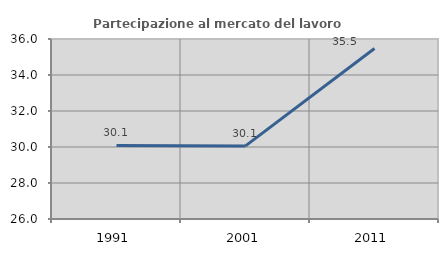
| Category | Partecipazione al mercato del lavoro  femminile |
|---|---|
| 1991.0 | 30.088 |
| 2001.0 | 30.062 |
| 2011.0 | 35.474 |